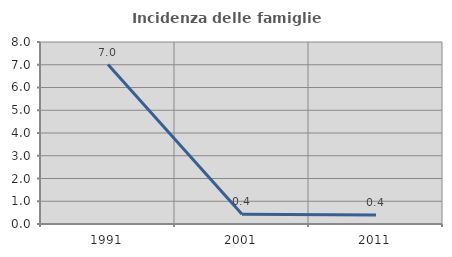
| Category | Incidenza delle famiglie numerose |
|---|---|
| 1991.0 | 7.009 |
| 2001.0 | 0.426 |
| 2011.0 | 0.397 |